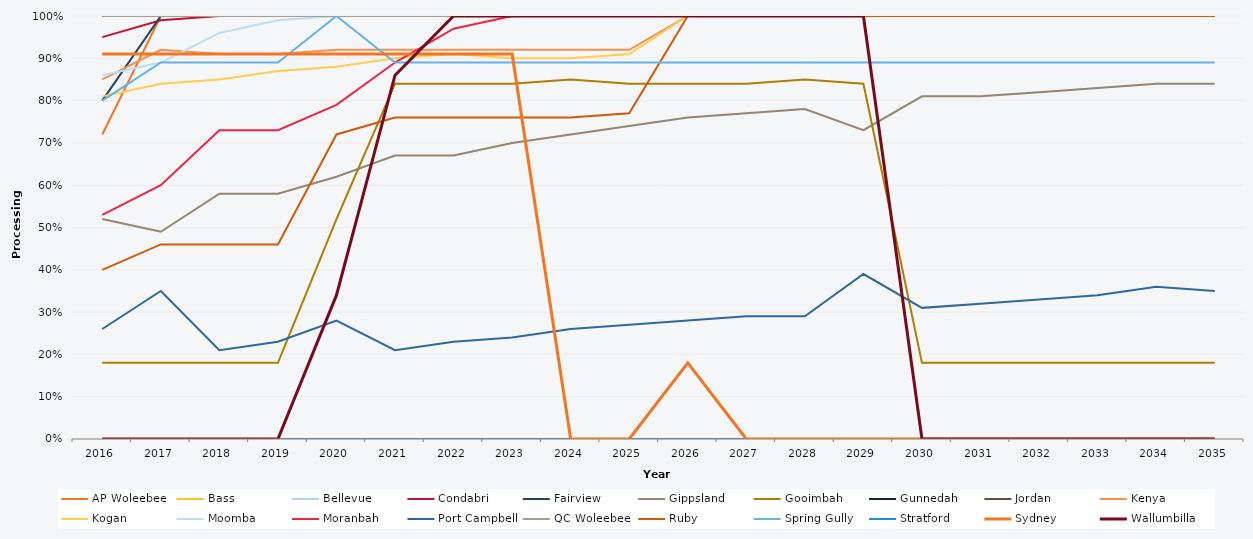
| Category | AP Woleebee | Bass | Bellevue | Condabri | Fairview | Gippsland | Gooimbah | Gunnedah | Jordan | Kenya | Kogan | Moomba | Moranbah | Port Campbell | QC Woleebee | Ruby | Spring Gully | Stratford | Sydney | Wallumbilla |
|---|---|---|---|---|---|---|---|---|---|---|---|---|---|---|---|---|---|---|---|---|
| 2016.0 | 0.72 | 1 | 1 | 0.95 | 0.8 | 0.52 | 0.18 | 0 | 1 | 0.85 | 0.81 | 0.86 | 0.53 | 0.26 | 1 | 0.4 | 0.8 | 0 | 0.91 | 0 |
| 2017.0 | 1 | 1 | 1 | 0.99 | 1 | 0.49 | 0.18 | 0 | 1 | 0.92 | 0.84 | 0.89 | 0.6 | 0.35 | 1 | 0.46 | 0.89 | 0 | 0.91 | 0 |
| 2018.0 | 1 | 1 | 1 | 1 | 1 | 0.58 | 0.18 | 0 | 1 | 0.91 | 0.85 | 0.96 | 0.73 | 0.21 | 1 | 0.46 | 0.89 | 0 | 0.91 | 0 |
| 2019.0 | 1 | 1 | 1 | 1 | 1 | 0.58 | 0.18 | 0 | 1 | 0.91 | 0.87 | 0.99 | 0.73 | 0.23 | 1 | 0.46 | 0.89 | 0 | 0.91 | 0 |
| 2020.0 | 1 | 1 | 1 | 1 | 1 | 0.62 | 0.52 | 0 | 1 | 0.92 | 0.88 | 1 | 0.79 | 0.28 | 1 | 0.72 | 1 | 0 | 0.91 | 0.34 |
| 2021.0 | 1 | 1 | 1 | 1 | 1 | 0.67 | 0.84 | 0 | 1 | 0.92 | 0.9 | 1 | 0.89 | 0.21 | 1 | 0.76 | 0.89 | 0 | 0.91 | 0.86 |
| 2022.0 | 1 | 1 | 1 | 1 | 1 | 0.67 | 0.84 | 0 | 1 | 0.92 | 0.91 | 1 | 0.97 | 0.23 | 1 | 0.76 | 0.89 | 0 | 0.91 | 1 |
| 2023.0 | 1 | 1 | 1 | 1 | 1 | 0.7 | 0.84 | 0 | 1 | 0.92 | 0.9 | 1 | 1 | 0.24 | 1 | 0.76 | 0.89 | 0 | 0.91 | 1 |
| 2024.0 | 1 | 1 | 1 | 1 | 1 | 0.72 | 0.85 | 0 | 1 | 0.92 | 0.9 | 1 | 1 | 0.26 | 1 | 0.76 | 0.89 | 0 | 0 | 1 |
| 2025.0 | 1 | 1 | 1 | 1 | 1 | 0.74 | 0.84 | 0 | 1 | 0.92 | 0.91 | 1 | 1 | 0.27 | 1 | 0.77 | 0.89 | 0 | 0 | 1 |
| 2026.0 | 1 | 1 | 1 | 1 | 1 | 0.76 | 0.84 | 0 | 1 | 1 | 1 | 1 | 1 | 0.28 | 1 | 1 | 0.89 | 0 | 0.18 | 1 |
| 2027.0 | 1 | 1 | 1 | 1 | 1 | 0.77 | 0.84 | 0 | 1 | 1 | 1 | 1 | 1 | 0.29 | 1 | 1 | 0.89 | 0 | 0 | 1 |
| 2028.0 | 1 | 1 | 1 | 1 | 1 | 0.78 | 0.85 | 0 | 1 | 1 | 1 | 1 | 1 | 0.29 | 1 | 1 | 0.89 | 0 | 0 | 1 |
| 2029.0 | 1 | 1 | 1 | 1 | 1 | 0.73 | 0.84 | 0 | 1 | 1 | 1 | 1 | 1 | 0.39 | 1 | 1 | 0.89 | 0 | 0 | 1 |
| 2030.0 | 1 | 1 | 1 | 1 | 1 | 0.81 | 0.18 | 0 | 1 | 1 | 1 | 1 | 1 | 0.31 | 1 | 1 | 0.89 | 0 | 0 | 0 |
| 2031.0 | 1 | 1 | 1 | 1 | 1 | 0.81 | 0.18 | 0 | 1 | 1 | 1 | 1 | 1 | 0.32 | 1 | 1 | 0.89 | 0 | 0 | 0 |
| 2032.0 | 1 | 1 | 1 | 1 | 1 | 0.82 | 0.18 | 0 | 1 | 1 | 1 | 1 | 1 | 0.33 | 1 | 1 | 0.89 | 0 | 0 | 0 |
| 2033.0 | 1 | 1 | 1 | 1 | 1 | 0.83 | 0.18 | 0 | 1 | 1 | 1 | 1 | 1 | 0.34 | 1 | 1 | 0.89 | 0 | 0 | 0 |
| 2034.0 | 1 | 1 | 1 | 1 | 1 | 0.84 | 0.18 | 0 | 1 | 1 | 1 | 1 | 1 | 0.36 | 1 | 1 | 0.89 | 0 | 0 | 0 |
| 2035.0 | 1 | 1 | 1 | 1 | 1 | 0.84 | 0.18 | 0 | 1 | 1 | 1 | 1 | 1 | 0.35 | 1 | 1 | 0.89 | 0 | 0 | 0 |